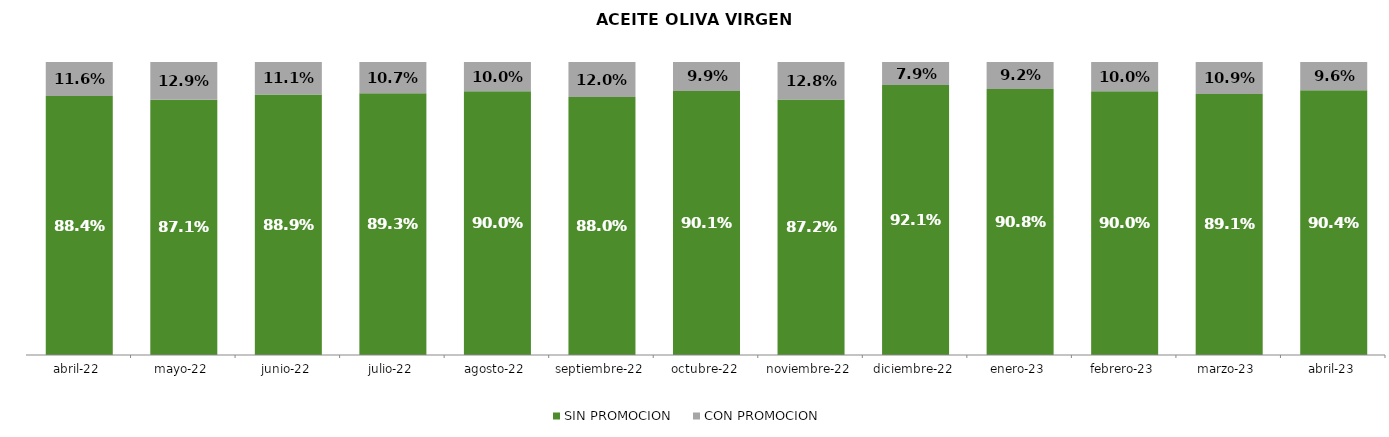
| Category | SIN PROMOCION   | CON PROMOCION   |
|---|---|---|
| 2022-04-01 | 0.884 | 0.116 |
| 2022-05-01 | 0.871 | 0.129 |
| 2022-06-01 | 0.889 | 0.111 |
| 2022-07-01 | 0.893 | 0.107 |
| 2022-08-01 | 0.9 | 0.1 |
| 2022-09-01 | 0.88 | 0.12 |
| 2022-10-01 | 0.901 | 0.099 |
| 2022-11-01 | 0.872 | 0.128 |
| 2022-12-01 | 0.921 | 0.079 |
| 2023-01-01 | 0.908 | 0.092 |
| 2023-02-01 | 0.9 | 0.1 |
| 2023-03-01 | 0.891 | 0.109 |
| 2023-04-01 | 0.904 | 0.096 |